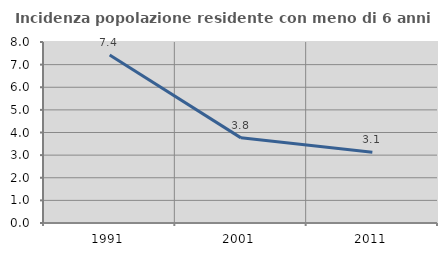
| Category | Incidenza popolazione residente con meno di 6 anni |
|---|---|
| 1991.0 | 7.421 |
| 2001.0 | 3.763 |
| 2011.0 | 3.125 |